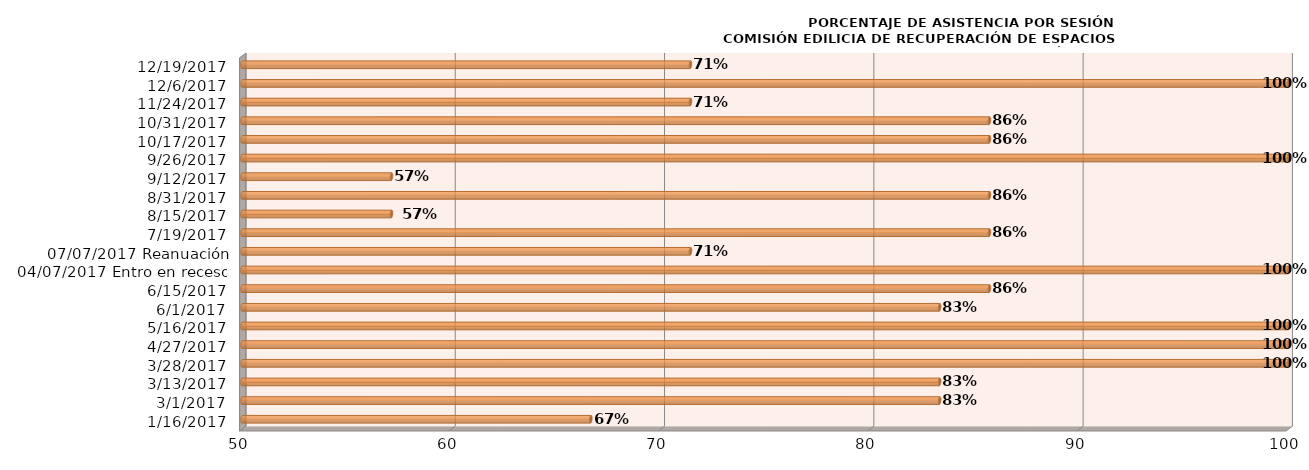
| Category | Series 0 |
|---|---|
| 16/01/2017 | 66.667 |
| 01/03/2017 | 83.333 |
| 13/03/2017 | 83.333 |
| 28/03/2017 | 100 |
| 27/04/2017 | 100 |
| 16/05/2017 | 100 |
| 01/06/2017 | 83.333 |
| 15/06/2017 | 85.714 |
| 04/07/2017 Entro en receso | 100 |
| 07/07/2017 Reanuación | 71.429 |
| 19/07/2017 | 85.714 |
| 15/08/2017 | 57.143 |
| 31/08/2017 | 85.714 |
| 12/09/2017 | 57.143 |
| 26/09/2017 | 100 |
| 17/10/2017 | 85.714 |
| 31/10/2017 | 85.714 |
| 24/11/2017 | 71.429 |
| 06/12/2017 | 100 |
| 19/12/2017 | 71.429 |